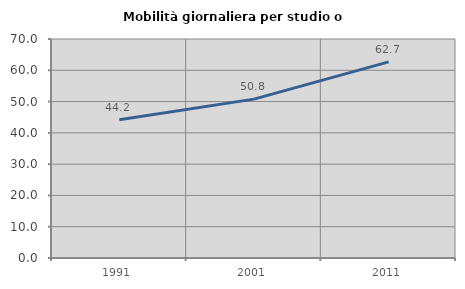
| Category | Mobilità giornaliera per studio o lavoro |
|---|---|
| 1991.0 | 44.221 |
| 2001.0 | 50.784 |
| 2011.0 | 62.678 |